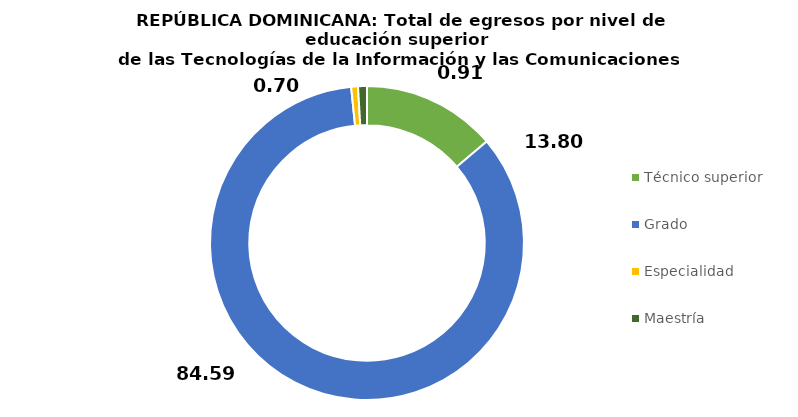
| Category | Series 0 |
|---|---|
| Técnico superior | 13.802 |
| Grado | 84.586 |
| Especialidad | 0.698 |
| Maestría | 0.913 |